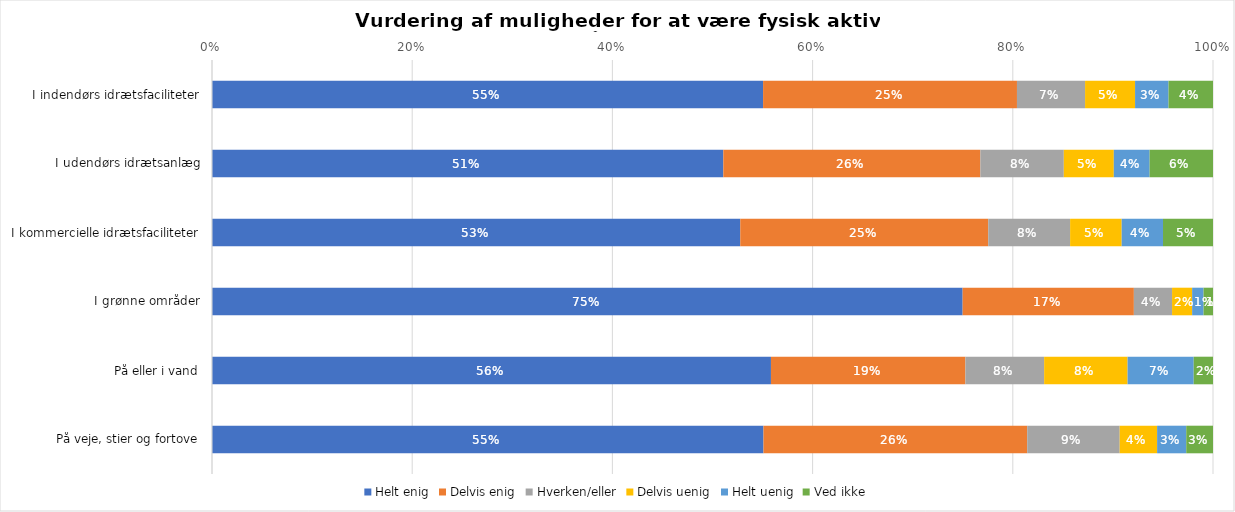
| Category | Helt enig | Delvis enig | Hverken/eller | Delvis uenig | Helt uenig | Ved ikke |
|---|---|---|---|---|---|---|
| I indendørs idrætsfaciliteter | 0.551 | 0.254 | 0.068 | 0.05 | 0.033 | 0.044 |
| I udendørs idrætsanlæg | 0.511 | 0.257 | 0.083 | 0.05 | 0.036 | 0.063 |
| I kommercielle idrætsfaciliteter | 0.528 | 0.248 | 0.082 | 0.052 | 0.041 | 0.05 |
| I grønne områder | 0.75 | 0.171 | 0.038 | 0.02 | 0.011 | 0.009 |
| På eller i vand | 0.558 | 0.194 | 0.079 | 0.083 | 0.066 | 0.019 |
| På veje, stier og fortove | 0.551 | 0.263 | 0.092 | 0.037 | 0.029 | 0.027 |